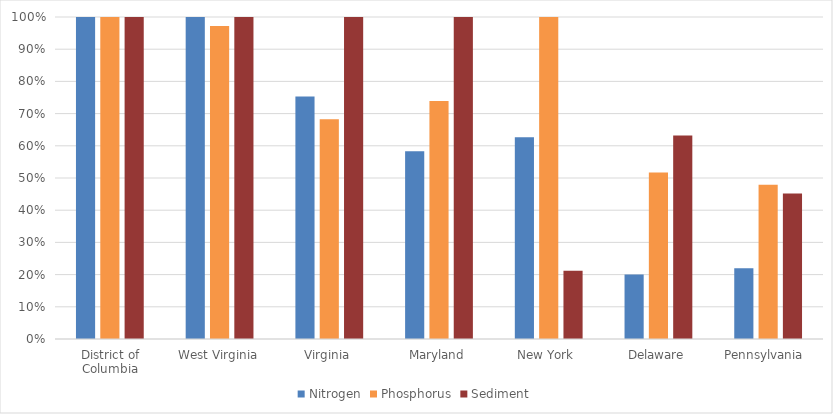
| Category | Nitrogen | Phosphorus | Sediment |
|---|---|---|---|
| District of Columbia | 1 | 1 | 1 |
| West Virginia | 1 | 0.972 | 1 |
| Virginia | 0.753 | 0.682 | 1 |
| Maryland | 0.583 | 0.739 | 1 |
| New York  | 0.627 | 1 | 0.212 |
| Delaware | 0.201 | 0.517 | 0.632 |
| Pennsylvania  | 0.22 | 0.479 | 0.452 |